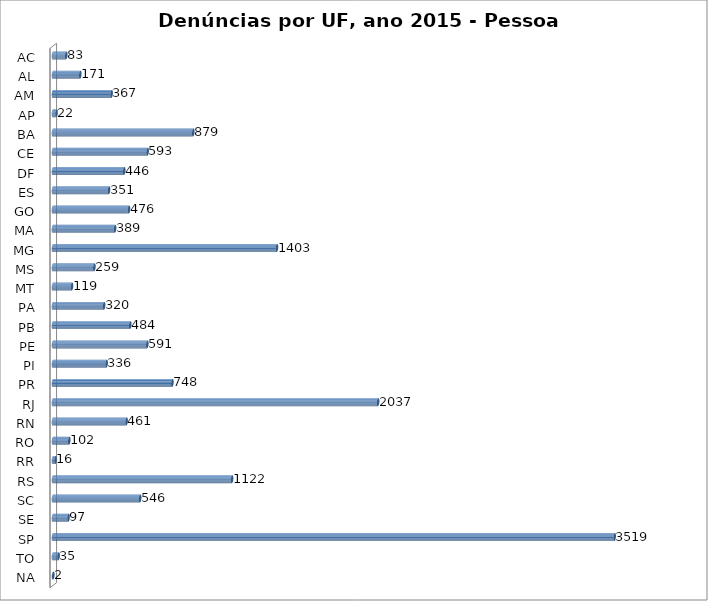
| Category | Series 0 |
|---|---|
| AC | 83 |
| AL | 171 |
| AM | 367 |
| AP | 22 |
| BA | 879 |
| CE | 593 |
| DF | 446 |
| ES | 351 |
| GO | 476 |
| MA | 389 |
| MG | 1403 |
| MS | 259 |
| MT | 119 |
| PA | 320 |
| PB | 484 |
| PE | 591 |
| PI | 336 |
| PR | 748 |
| RJ | 2037 |
| RN | 461 |
| RO | 102 |
| RR | 16 |
| RS | 1122 |
| SC | 546 |
| SE | 97 |
| SP | 3519 |
| TO | 35 |
| NA | 2 |